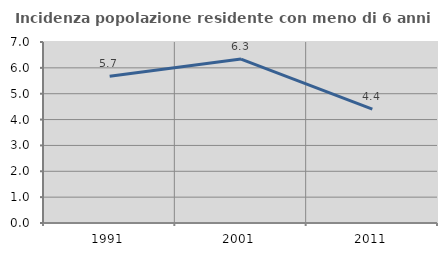
| Category | Incidenza popolazione residente con meno di 6 anni |
|---|---|
| 1991.0 | 5.678 |
| 2001.0 | 6.339 |
| 2011.0 | 4.403 |